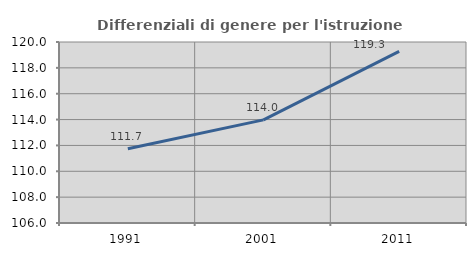
| Category | Differenziali di genere per l'istruzione superiore |
|---|---|
| 1991.0 | 111.749 |
| 2001.0 | 113.976 |
| 2011.0 | 119.278 |